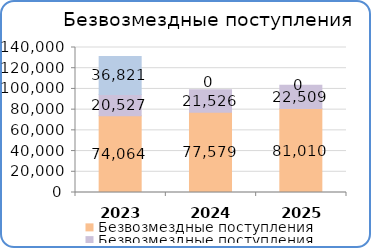
| Category | Дотации | Субвенции | Субсидии |
|---|---|---|---|
| 2023 | 74063900 | 20526600 | 36820800 |
| 2024 | 77578900 | 21525600 | 0 |
| 2025 | 81010300 | 22509100 | 0 |